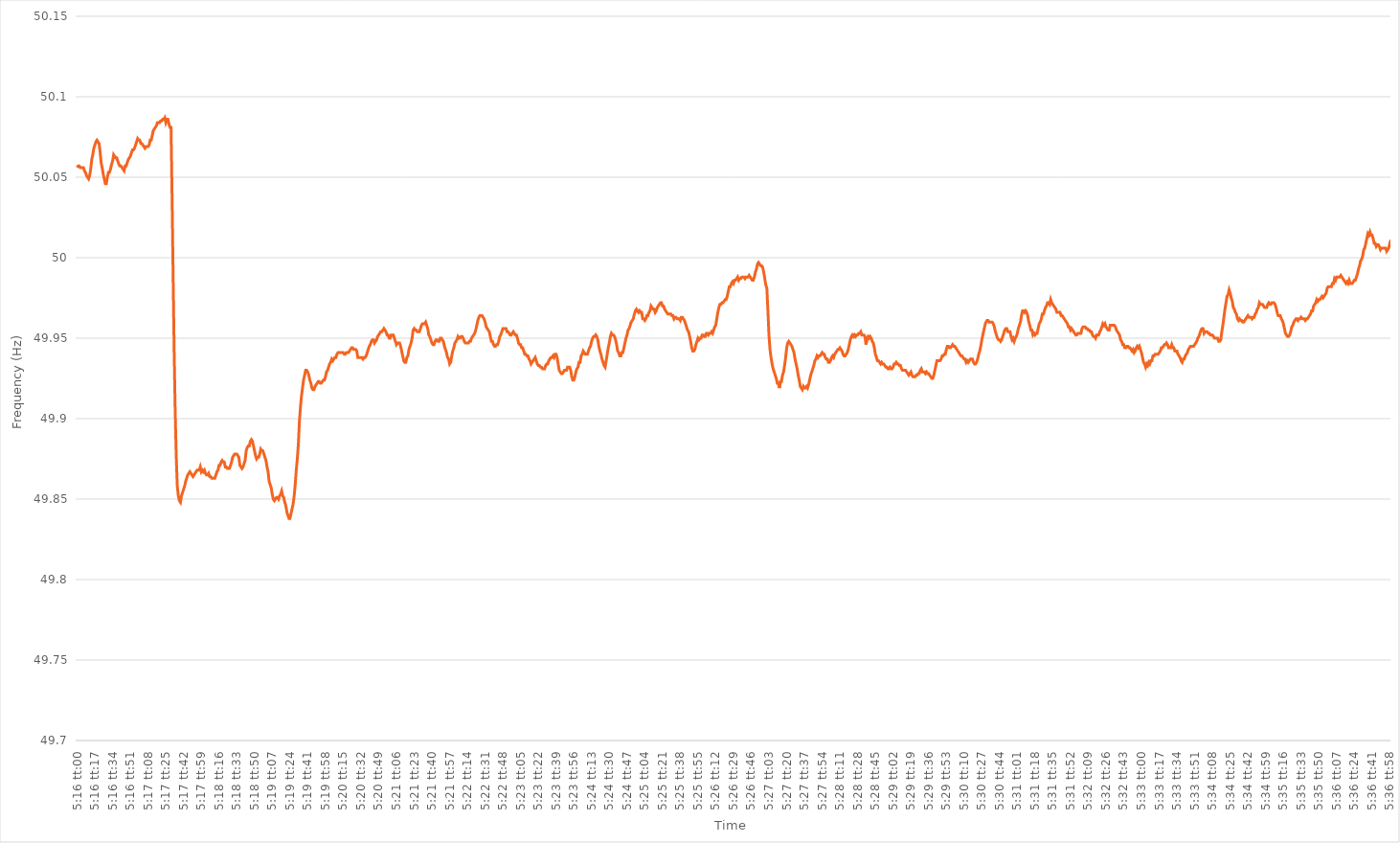
| Category | Series 0 |
|---|---|
| 0.21944444444444444 | 50.056 |
| 0.2194560185185185 | 50.057 |
| 0.2194675925925926 | 50.057 |
| 0.21947916666666667 | 50.056 |
| 0.21949074074074074 | 50.056 |
| 0.21950231481481483 | 50.056 |
| 0.2195138888888889 | 50.056 |
| 0.21952546296296296 | 50.054 |
| 0.21953703703703706 | 50.053 |
| 0.21954861111111112 | 50.051 |
| 0.2195601851851852 | 50.05 |
| 0.21957175925925929 | 50.049 |
| 0.21958333333333332 | 50.051 |
| 0.2195949074074074 | 50.055 |
| 0.21960648148148146 | 50.061 |
| 0.21961805555555555 | 50.064 |
| 0.21962962962962962 | 50.068 |
| 0.21964120370370369 | 50.07 |
| 0.21965277777777778 | 50.072 |
| 0.21966435185185185 | 50.073 |
| 0.2196759259259259 | 50.072 |
| 0.2196875 | 50.071 |
| 0.21969907407407407 | 50.066 |
| 0.21971064814814814 | 50.059 |
| 0.21972222222222224 | 50.056 |
| 0.2197337962962963 | 50.052 |
| 0.21974537037037037 | 50.049 |
| 0.21975694444444446 | 50.046 |
| 0.21976851851851853 | 50.046 |
| 0.2197800925925926 | 50.05 |
| 0.2197916666666667 | 50.053 |
| 0.21980324074074076 | 50.053 |
| 0.21981481481481482 | 50.055 |
| 0.21982638888888886 | 50.058 |
| 0.21983796296296296 | 50.06 |
| 0.21984953703703702 | 50.064 |
| 0.2198611111111111 | 50.063 |
| 0.21987268518518518 | 50.062 |
| 0.21988425925925925 | 50.062 |
| 0.21989583333333332 | 50.06 |
| 0.2199074074074074 | 50.058 |
| 0.21991898148148148 | 50.057 |
| 0.21993055555555555 | 50.057 |
| 0.21994212962962964 | 50.056 |
| 0.2199537037037037 | 50.055 |
| 0.21996527777777777 | 50.054 |
| 0.21997685185185187 | 50.057 |
| 0.21998842592592593 | 50.057 |
| 0.22 | 50.059 |
| 0.2200115740740741 | 50.061 |
| 0.22002314814814816 | 50.062 |
| 0.22003472222222223 | 50.063 |
| 0.22004629629629632 | 50.065 |
| 0.22005787037037036 | 50.067 |
| 0.22006944444444443 | 50.067 |
| 0.2200810185185185 | 50.068 |
| 0.2200925925925926 | 50.07 |
| 0.22010416666666666 | 50.072 |
| 0.22011574074074072 | 50.074 |
| 0.22012731481481482 | 50.073 |
| 0.22013888888888888 | 50.073 |
| 0.22015046296296295 | 50.071 |
| 0.22016203703703704 | 50.071 |
| 0.2201736111111111 | 50.07 |
| 0.22018518518518518 | 50.069 |
| 0.22019675925925927 | 50.068 |
| 0.22020833333333334 | 50.069 |
| 0.2202199074074074 | 50.069 |
| 0.2202314814814815 | 50.069 |
| 0.22024305555555557 | 50.07 |
| 0.22025462962962963 | 50.073 |
| 0.22026620370370373 | 50.073 |
| 0.2202777777777778 | 50.076 |
| 0.22028935185185183 | 50.079 |
| 0.2203009259259259 | 50.08 |
| 0.2203125 | 50.081 |
| 0.22032407407407406 | 50.082 |
| 0.22033564814814813 | 50.084 |
| 0.22034722222222222 | 50.084 |
| 0.2203587962962963 | 50.084 |
| 0.22037037037037036 | 50.085 |
| 0.22038194444444445 | 50.085 |
| 0.22039351851851852 | 50.086 |
| 0.22040509259259258 | 50.086 |
| 0.22041666666666668 | 50.087 |
| 0.22042824074074074 | 50.084 |
| 0.2204398148148148 | 50.086 |
| 0.2204513888888889 | 50.086 |
| 0.22046296296296297 | 50.083 |
| 0.22047453703703704 | 50.081 |
| 0.22048611111111113 | 50.081 |
| 0.2204976851851852 | 50.037 |
| 0.22050925925925927 | 49.988 |
| 0.22052083333333336 | 49.941 |
| 0.2205324074074074 | 49.904 |
| 0.22054398148148147 | 49.876 |
| 0.22055555555555553 | 49.858 |
| 0.22056712962962963 | 49.852 |
| 0.2205787037037037 | 49.849 |
| 0.22059027777777776 | 49.848 |
| 0.22060185185185185 | 49.852 |
| 0.22061342592592592 | 49.854 |
| 0.220625 | 49.856 |
| 0.22063657407407408 | 49.858 |
| 0.22064814814814815 | 49.861 |
| 0.22065972222222222 | 49.863 |
| 0.2206712962962963 | 49.865 |
| 0.22068287037037038 | 49.866 |
| 0.22069444444444444 | 49.867 |
| 0.22070601851851854 | 49.866 |
| 0.2207175925925926 | 49.865 |
| 0.22072916666666667 | 49.864 |
| 0.22074074074074077 | 49.865 |
| 0.22075231481481483 | 49.866 |
| 0.22076388888888887 | 49.867 |
| 0.22077546296296294 | 49.868 |
| 0.22078703703703703 | 49.868 |
| 0.2207986111111111 | 49.868 |
| 0.22081018518518516 | 49.87 |
| 0.22082175925925926 | 49.867 |
| 0.22083333333333333 | 49.868 |
| 0.2208449074074074 | 49.867 |
| 0.2208564814814815 | 49.868 |
| 0.22086805555555555 | 49.866 |
| 0.22087962962962962 | 49.865 |
| 0.22089120370370371 | 49.865 |
| 0.22090277777777778 | 49.866 |
| 0.22091435185185185 | 49.864 |
| 0.22092592592592594 | 49.864 |
| 0.2209375 | 49.863 |
| 0.22094907407407408 | 49.863 |
| 0.22096064814814817 | 49.863 |
| 0.22097222222222224 | 49.863 |
| 0.2209837962962963 | 49.865 |
| 0.2209953703703704 | 49.867 |
| 0.22100694444444444 | 49.868 |
| 0.2210185185185185 | 49.871 |
| 0.22103009259259257 | 49.871 |
| 0.22104166666666666 | 49.873 |
| 0.22105324074074073 | 49.874 |
| 0.2210648148148148 | 49.873 |
| 0.2210763888888889 | 49.873 |
| 0.22108796296296296 | 49.87 |
| 0.22109953703703702 | 49.87 |
| 0.22111111111111112 | 49.869 |
| 0.22112268518518519 | 49.869 |
| 0.22113425925925925 | 49.869 |
| 0.22114583333333335 | 49.871 |
| 0.2211574074074074 | 49.873 |
| 0.22116898148148148 | 49.876 |
| 0.22118055555555557 | 49.877 |
| 0.22119212962962964 | 49.878 |
| 0.2212037037037037 | 49.878 |
| 0.2212152777777778 | 49.878 |
| 0.22122685185185187 | 49.877 |
| 0.2212384259259259 | 49.876 |
| 0.22124999999999997 | 49.871 |
| 0.22126157407407407 | 49.87 |
| 0.22127314814814814 | 49.869 |
| 0.2212847222222222 | 49.87 |
| 0.2212962962962963 | 49.872 |
| 0.22130787037037036 | 49.874 |
| 0.22131944444444443 | 49.88 |
| 0.22133101851851852 | 49.882 |
| 0.2213425925925926 | 49.883 |
| 0.22135416666666666 | 49.883 |
| 0.22136574074074075 | 49.886 |
| 0.22137731481481482 | 49.887 |
| 0.22138888888888889 | 49.886 |
| 0.22140046296296298 | 49.883 |
| 0.22141203703703705 | 49.88 |
| 0.2214236111111111 | 49.877 |
| 0.2214351851851852 | 49.875 |
| 0.22144675925925927 | 49.876 |
| 0.22145833333333334 | 49.876 |
| 0.22146990740740743 | 49.878 |
| 0.22148148148148147 | 49.881 |
| 0.22149305555555554 | 49.88 |
| 0.2215046296296296 | 49.88 |
| 0.2215162037037037 | 49.878 |
| 0.22152777777777777 | 49.876 |
| 0.22153935185185183 | 49.874 |
| 0.22155092592592593 | 49.87 |
| 0.2215625 | 49.867 |
| 0.22157407407407406 | 49.861 |
| 0.22158564814814816 | 49.859 |
| 0.22159722222222222 | 49.857 |
| 0.2216087962962963 | 49.853 |
| 0.22162037037037038 | 49.85 |
| 0.22163194444444445 | 49.849 |
| 0.22164351851851852 | 49.85 |
| 0.2216550925925926 | 49.851 |
| 0.22166666666666668 | 49.851 |
| 0.22167824074074075 | 49.85 |
| 0.22168981481481484 | 49.852 |
| 0.2217013888888889 | 49.853 |
| 0.22171296296296295 | 49.855 |
| 0.221724537037037 | 49.852 |
| 0.2217361111111111 | 49.851 |
| 0.22174768518518517 | 49.848 |
| 0.22175925925925924 | 49.846 |
| 0.22177083333333333 | 49.842 |
| 0.2217824074074074 | 49.84 |
| 0.22179398148148147 | 49.838 |
| 0.22180555555555556 | 49.838 |
| 0.22181712962962963 | 49.841 |
| 0.2218287037037037 | 49.844 |
| 0.2218402777777778 | 49.847 |
| 0.22185185185185186 | 49.852 |
| 0.22186342592592592 | 49.859 |
| 0.22187500000000002 | 49.868 |
| 0.22188657407407408 | 49.875 |
| 0.22189814814814815 | 49.884 |
| 0.22190972222222224 | 49.898 |
| 0.2219212962962963 | 49.907 |
| 0.22193287037037038 | 49.914 |
| 0.22194444444444447 | 49.919 |
| 0.2219560185185185 | 49.924 |
| 0.22196759259259258 | 49.927 |
| 0.22197916666666664 | 49.93 |
| 0.22199074074074074 | 49.93 |
| 0.2220023148148148 | 49.929 |
| 0.22201388888888887 | 49.927 |
| 0.22202546296296297 | 49.924 |
| 0.22203703703703703 | 49.922 |
| 0.2220486111111111 | 49.919 |
| 0.2220601851851852 | 49.918 |
| 0.22207175925925926 | 49.918 |
| 0.22208333333333333 | 49.92 |
| 0.22209490740740742 | 49.921 |
| 0.2221064814814815 | 49.922 |
| 0.22211805555555555 | 49.923 |
| 0.22212962962962965 | 49.923 |
| 0.22214120370370372 | 49.922 |
| 0.22215277777777778 | 49.922 |
| 0.22216435185185188 | 49.923 |
| 0.22217592592592594 | 49.924 |
| 0.22218749999999998 | 49.924 |
| 0.22219907407407405 | 49.926 |
| 0.22221064814814814 | 49.929 |
| 0.2222222222222222 | 49.93 |
| 0.22223379629629628 | 49.932 |
| 0.22224537037037037 | 49.934 |
| 0.22225694444444444 | 49.935 |
| 0.2222685185185185 | 49.937 |
| 0.2222800925925926 | 49.936 |
| 0.22229166666666667 | 49.937 |
| 0.22230324074074073 | 49.938 |
| 0.22231481481481483 | 49.938 |
| 0.2223263888888889 | 49.94 |
| 0.22233796296296296 | 49.941 |
| 0.22234953703703705 | 49.941 |
| 0.22236111111111112 | 49.941 |
| 0.2223726851851852 | 49.941 |
| 0.22238425925925928 | 49.941 |
| 0.22239583333333335 | 49.941 |
| 0.22240740740740741 | 49.94 |
| 0.2224189814814815 | 49.94 |
| 0.22243055555555555 | 49.941 |
| 0.22244212962962961 | 49.941 |
| 0.22245370370370368 | 49.941 |
| 0.22246527777777778 | 49.942 |
| 0.22247685185185184 | 49.943 |
| 0.2224884259259259 | 49.944 |
| 0.2225 | 49.944 |
| 0.22251157407407407 | 49.943 |
| 0.22252314814814814 | 49.943 |
| 0.22253472222222223 | 49.943 |
| 0.2225462962962963 | 49.942 |
| 0.22255787037037036 | 49.938 |
| 0.22256944444444446 | 49.938 |
| 0.22258101851851853 | 49.938 |
| 0.2225925925925926 | 49.938 |
| 0.2226041666666667 | 49.938 |
| 0.22261574074074075 | 49.937 |
| 0.22262731481481482 | 49.938 |
| 0.22263888888888891 | 49.938 |
| 0.22265046296296298 | 49.939 |
| 0.22266203703703702 | 49.941 |
| 0.22267361111111109 | 49.943 |
| 0.22268518518518518 | 49.945 |
| 0.22269675925925925 | 49.946 |
| 0.2227083333333333 | 49.948 |
| 0.2227199074074074 | 49.949 |
| 0.22273148148148147 | 49.949 |
| 0.22274305555555554 | 49.947 |
| 0.22275462962962964 | 49.948 |
| 0.2227662037037037 | 49.949 |
| 0.22277777777777777 | 49.951 |
| 0.22278935185185186 | 49.952 |
| 0.22280092592592593 | 49.953 |
| 0.2228125 | 49.954 |
| 0.2228240740740741 | 49.954 |
| 0.22283564814814816 | 49.955 |
| 0.22284722222222222 | 49.956 |
| 0.22285879629629632 | 49.955 |
| 0.22287037037037039 | 49.954 |
| 0.22288194444444445 | 49.952 |
| 0.2228935185185185 | 49.952 |
| 0.22290509259259259 | 49.95 |
| 0.22291666666666665 | 49.95 |
| 0.22292824074074072 | 49.952 |
| 0.2229398148148148 | 49.952 |
| 0.22295138888888888 | 49.952 |
| 0.22296296296296295 | 49.95 |
| 0.22297453703703704 | 49.948 |
| 0.2229861111111111 | 49.946 |
| 0.22299768518518517 | 49.947 |
| 0.22300925925925927 | 49.947 |
| 0.22302083333333333 | 49.947 |
| 0.2230324074074074 | 49.945 |
| 0.2230439814814815 | 49.942 |
| 0.22305555555555556 | 49.939 |
| 0.22306712962962963 | 49.936 |
| 0.22307870370370372 | 49.935 |
| 0.2230902777777778 | 49.935 |
| 0.22310185185185186 | 49.938 |
| 0.22311342592592595 | 49.939 |
| 0.22312500000000002 | 49.943 |
| 0.22313657407407406 | 49.945 |
| 0.22314814814814812 | 49.947 |
| 0.22315972222222222 | 49.95 |
| 0.22317129629629628 | 49.955 |
| 0.22318287037037035 | 49.956 |
| 0.22319444444444445 | 49.955 |
| 0.2232060185185185 | 49.955 |
| 0.22321759259259258 | 49.954 |
| 0.22322916666666667 | 49.954 |
| 0.22324074074074074 | 49.954 |
| 0.2232523148148148 | 49.956 |
| 0.2232638888888889 | 49.958 |
| 0.22327546296296297 | 49.959 |
| 0.22328703703703703 | 49.959 |
| 0.22329861111111113 | 49.959 |
| 0.2233101851851852 | 49.96 |
| 0.22332175925925926 | 49.958 |
| 0.22333333333333336 | 49.956 |
| 0.22334490740740742 | 49.952 |
| 0.2233564814814815 | 49.951 |
| 0.22336805555555553 | 49.949 |
| 0.22337962962962962 | 49.947 |
| 0.2233912037037037 | 49.946 |
| 0.22340277777777776 | 49.946 |
| 0.22341435185185185 | 49.948 |
| 0.22342592592592592 | 49.949 |
| 0.22343749999999998 | 49.949 |
| 0.22344907407407408 | 49.948 |
| 0.22346064814814814 | 49.948 |
| 0.2234722222222222 | 49.95 |
| 0.2234837962962963 | 49.95 |
| 0.22349537037037037 | 49.949 |
| 0.22350694444444444 | 49.948 |
| 0.22351851851851853 | 49.945 |
| 0.2235300925925926 | 49.943 |
| 0.22354166666666667 | 49.941 |
| 0.22355324074074076 | 49.938 |
| 0.22356481481481483 | 49.937 |
| 0.2235763888888889 | 49.934 |
| 0.223587962962963 | 49.935 |
| 0.22359953703703705 | 49.939 |
| 0.2236111111111111 | 49.942 |
| 0.22362268518518516 | 49.944 |
| 0.22363425925925925 | 49.947 |
| 0.22364583333333332 | 49.948 |
| 0.2236574074074074 | 49.949 |
| 0.22366898148148148 | 49.951 |
| 0.22368055555555555 | 49.95 |
| 0.22369212962962962 | 49.95 |
| 0.2237037037037037 | 49.951 |
| 0.22371527777777778 | 49.951 |
| 0.22372685185185184 | 49.95 |
| 0.22373842592592594 | 49.948 |
| 0.22375 | 49.947 |
| 0.22376157407407407 | 49.947 |
| 0.22377314814814817 | 49.947 |
| 0.22378472222222223 | 49.947 |
| 0.2237962962962963 | 49.948 |
| 0.2238078703703704 | 49.948 |
| 0.22381944444444446 | 49.95 |
| 0.22383101851851853 | 49.951 |
| 0.22384259259259257 | 49.952 |
| 0.22385416666666666 | 49.953 |
| 0.22386574074074073 | 49.955 |
| 0.2238773148148148 | 49.958 |
| 0.2238888888888889 | 49.961 |
| 0.22390046296296295 | 49.963 |
| 0.22391203703703702 | 49.964 |
| 0.22392361111111111 | 49.964 |
| 0.22393518518518518 | 49.964 |
| 0.22394675925925925 | 49.963 |
| 0.22395833333333334 | 49.962 |
| 0.2239699074074074 | 49.96 |
| 0.22398148148148148 | 49.957 |
| 0.22399305555555557 | 49.956 |
| 0.22400462962962964 | 49.955 |
| 0.2240162037037037 | 49.954 |
| 0.2240277777777778 | 49.951 |
| 0.22403935185185186 | 49.948 |
| 0.22405092592592593 | 49.948 |
| 0.22406250000000003 | 49.946 |
| 0.2240740740740741 | 49.945 |
| 0.22408564814814813 | 49.945 |
| 0.2240972222222222 | 49.946 |
| 0.2241087962962963 | 49.946 |
| 0.22412037037037036 | 49.948 |
| 0.22413194444444443 | 49.951 |
| 0.22414351851851852 | 49.952 |
| 0.2241550925925926 | 49.954 |
| 0.22416666666666665 | 49.956 |
| 0.22417824074074075 | 49.956 |
| 0.22418981481481481 | 49.956 |
| 0.22420138888888888 | 49.956 |
| 0.22421296296296298 | 49.954 |
| 0.22422453703703704 | 49.954 |
| 0.2242361111111111 | 49.953 |
| 0.2242476851851852 | 49.952 |
| 0.22425925925925927 | 49.952 |
| 0.22427083333333334 | 49.953 |
| 0.22428240740740743 | 49.954 |
| 0.2242939814814815 | 49.953 |
| 0.22430555555555556 | 49.952 |
| 0.2243171296296296 | 49.952 |
| 0.2243287037037037 | 49.95 |
| 0.22434027777777776 | 49.947 |
| 0.22435185185185183 | 49.946 |
| 0.22436342592592592 | 49.946 |
| 0.224375 | 49.944 |
| 0.22438657407407406 | 49.944 |
| 0.22439814814814815 | 49.942 |
| 0.22440972222222222 | 49.94 |
| 0.22442129629629629 | 49.94 |
| 0.22443287037037038 | 49.939 |
| 0.22444444444444445 | 49.939 |
| 0.2244560185185185 | 49.937 |
| 0.2244675925925926 | 49.936 |
| 0.22447916666666667 | 49.934 |
| 0.22449074074074074 | 49.935 |
| 0.22450231481481484 | 49.936 |
| 0.2245138888888889 | 49.937 |
| 0.22452546296296297 | 49.938 |
| 0.22453703703703706 | 49.936 |
| 0.22454861111111113 | 49.934 |
| 0.22456018518518517 | 49.933 |
| 0.22457175925925923 | 49.933 |
| 0.22458333333333333 | 49.932 |
| 0.2245949074074074 | 49.932 |
| 0.22460648148148146 | 49.931 |
| 0.22461805555555556 | 49.931 |
| 0.22462962962962962 | 49.931 |
| 0.2246412037037037 | 49.933 |
| 0.22465277777777778 | 49.934 |
| 0.22466435185185185 | 49.934 |
| 0.22467592592592592 | 49.936 |
| 0.2246875 | 49.937 |
| 0.22469907407407408 | 49.938 |
| 0.22471064814814815 | 49.938 |
| 0.22472222222222224 | 49.939 |
| 0.2247337962962963 | 49.938 |
| 0.22474537037037037 | 49.94 |
| 0.22475694444444447 | 49.94 |
| 0.22476851851851853 | 49.938 |
| 0.2247800925925926 | 49.934 |
| 0.22479166666666664 | 49.93 |
| 0.22480324074074073 | 49.929 |
| 0.2248148148148148 | 49.928 |
| 0.22482638888888887 | 49.928 |
| 0.22483796296296296 | 49.929 |
| 0.22484953703703703 | 49.93 |
| 0.2248611111111111 | 49.93 |
| 0.2248726851851852 | 49.93 |
| 0.22488425925925926 | 49.932 |
| 0.22489583333333332 | 49.932 |
| 0.22490740740740742 | 49.932 |
| 0.22491898148148148 | 49.93 |
| 0.22493055555555555 | 49.926 |
| 0.22494212962962964 | 49.924 |
| 0.2249537037037037 | 49.924 |
| 0.22496527777777778 | 49.926 |
| 0.22497685185185187 | 49.929 |
| 0.22498842592592594 | 49.931 |
| 0.225 | 49.932 |
| 0.2250115740740741 | 49.935 |
| 0.22502314814814817 | 49.935 |
| 0.2250347222222222 | 49.939 |
| 0.22504629629629627 | 49.94 |
| 0.22505787037037037 | 49.942 |
| 0.22506944444444443 | 49.941 |
| 0.2250810185185185 | 49.94 |
| 0.2250925925925926 | 49.94 |
| 0.22510416666666666 | 49.94 |
| 0.22511574074074073 | 49.942 |
| 0.22512731481481482 | 49.944 |
| 0.2251388888888889 | 49.945 |
| 0.22515046296296296 | 49.948 |
| 0.22516203703703705 | 49.95 |
| 0.22517361111111112 | 49.951 |
| 0.22518518518518518 | 49.951 |
| 0.22519675925925928 | 49.952 |
| 0.22520833333333334 | 49.951 |
| 0.2252199074074074 | 49.949 |
| 0.2252314814814815 | 49.945 |
| 0.22524305555555557 | 49.942 |
| 0.22525462962962964 | 49.94 |
| 0.22526620370370368 | 49.937 |
| 0.22527777777777777 | 49.935 |
| 0.22528935185185184 | 49.933 |
| 0.2253009259259259 | 49.932 |
| 0.2253125 | 49.936 |
| 0.22532407407407407 | 49.94 |
| 0.22533564814814813 | 49.944 |
| 0.22534722222222223 | 49.947 |
| 0.2253587962962963 | 49.951 |
| 0.22537037037037036 | 49.953 |
| 0.22538194444444445 | 49.952 |
| 0.22539351851851852 | 49.952 |
| 0.2254050925925926 | 49.951 |
| 0.22541666666666668 | 49.949 |
| 0.22542824074074075 | 49.946 |
| 0.22543981481481482 | 49.942 |
| 0.2254513888888889 | 49.941 |
| 0.22546296296296298 | 49.939 |
| 0.22547453703703704 | 49.939 |
| 0.22548611111111114 | 49.941 |
| 0.22549768518518518 | 49.941 |
| 0.22550925925925924 | 49.944 |
| 0.2255208333333333 | 49.947 |
| 0.2255324074074074 | 49.95 |
| 0.22554398148148147 | 49.952 |
| 0.22555555555555554 | 49.955 |
| 0.22556712962962963 | 49.956 |
| 0.2255787037037037 | 49.958 |
| 0.22559027777777776 | 49.96 |
| 0.22560185185185186 | 49.961 |
| 0.22561342592592593 | 49.962 |
| 0.225625 | 49.965 |
| 0.2256365740740741 | 49.967 |
| 0.22564814814814815 | 49.968 |
| 0.22565972222222222 | 49.967 |
| 0.22567129629629631 | 49.966 |
| 0.22568287037037038 | 49.967 |
| 0.22569444444444445 | 49.966 |
| 0.22570601851851854 | 49.966 |
| 0.2257175925925926 | 49.962 |
| 0.22572916666666668 | 49.962 |
| 0.22574074074074071 | 49.961 |
| 0.2257523148148148 | 49.962 |
| 0.22576388888888888 | 49.964 |
| 0.22577546296296294 | 49.964 |
| 0.22578703703703704 | 49.966 |
| 0.2257986111111111 | 49.967 |
| 0.22581018518518517 | 49.97 |
| 0.22582175925925926 | 49.969 |
| 0.22583333333333333 | 49.968 |
| 0.2258449074074074 | 49.968 |
| 0.2258564814814815 | 49.966 |
| 0.22586805555555556 | 49.967 |
| 0.22587962962962962 | 49.969 |
| 0.22589120370370372 | 49.97 |
| 0.22590277777777779 | 49.971 |
| 0.22591435185185185 | 49.972 |
| 0.22592592592592595 | 49.972 |
| 0.2259375 | 49.97 |
| 0.22594907407407408 | 49.97 |
| 0.22596064814814817 | 49.968 |
| 0.2259722222222222 | 49.967 |
| 0.22598379629629628 | 49.966 |
| 0.22599537037037035 | 49.965 |
| 0.22600694444444444 | 49.965 |
| 0.2260185185185185 | 49.965 |
| 0.22603009259259257 | 49.965 |
| 0.22604166666666667 | 49.964 |
| 0.22605324074074074 | 49.964 |
| 0.2260648148148148 | 49.962 |
| 0.2260763888888889 | 49.963 |
| 0.22608796296296296 | 49.963 |
| 0.22609953703703703 | 49.962 |
| 0.22611111111111112 | 49.962 |
| 0.2261226851851852 | 49.962 |
| 0.22613425925925926 | 49.961 |
| 0.22614583333333335 | 49.963 |
| 0.22615740740740742 | 49.963 |
| 0.22616898148148148 | 49.962 |
| 0.22618055555555558 | 49.961 |
| 0.22619212962962965 | 49.959 |
| 0.2262037037037037 | 49.957 |
| 0.22621527777777775 | 49.955 |
| 0.22622685185185185 | 49.954 |
| 0.2262384259259259 | 49.951 |
| 0.22624999999999998 | 49.948 |
| 0.22626157407407407 | 49.944 |
| 0.22627314814814814 | 49.942 |
| 0.2262847222222222 | 49.942 |
| 0.2262962962962963 | 49.943 |
| 0.22630787037037037 | 49.946 |
| 0.22631944444444443 | 49.948 |
| 0.22633101851851853 | 49.95 |
| 0.2263425925925926 | 49.949 |
| 0.22635416666666666 | 49.95 |
| 0.22636574074074076 | 49.95 |
| 0.22637731481481482 | 49.952 |
| 0.2263888888888889 | 49.952 |
| 0.22640046296296298 | 49.951 |
| 0.22641203703703705 | 49.951 |
| 0.22642361111111112 | 49.953 |
| 0.2264351851851852 | 49.953 |
| 0.22644675925925925 | 49.952 |
| 0.22645833333333332 | 49.953 |
| 0.22646990740740738 | 49.953 |
| 0.22648148148148148 | 49.954 |
| 0.22649305555555554 | 49.953 |
| 0.2265046296296296 | 49.955 |
| 0.2265162037037037 | 49.957 |
| 0.22652777777777777 | 49.958 |
| 0.22653935185185184 | 49.962 |
| 0.22655092592592593 | 49.966 |
| 0.2265625 | 49.969 |
| 0.22657407407407407 | 49.971 |
| 0.22658564814814816 | 49.971 |
| 0.22659722222222223 | 49.972 |
| 0.2266087962962963 | 49.972 |
| 0.2266203703703704 | 49.973 |
| 0.22663194444444446 | 49.974 |
| 0.22664351851851852 | 49.974 |
| 0.22665509259259262 | 49.976 |
| 0.22666666666666668 | 49.979 |
| 0.22667824074074075 | 49.982 |
| 0.2266898148148148 | 49.982 |
| 0.22670138888888888 | 49.984 |
| 0.22671296296296295 | 49.985 |
| 0.22672453703703702 | 49.984 |
| 0.2267361111111111 | 49.986 |
| 0.22674768518518518 | 49.986 |
| 0.22675925925925924 | 49.987 |
| 0.22677083333333334 | 49.988 |
| 0.2267824074074074 | 49.986 |
| 0.22679398148148147 | 49.987 |
| 0.22680555555555557 | 49.987 |
| 0.22681712962962963 | 49.988 |
| 0.2268287037037037 | 49.988 |
| 0.2268402777777778 | 49.988 |
| 0.22685185185185186 | 49.987 |
| 0.22686342592592593 | 49.988 |
| 0.22687500000000002 | 49.988 |
| 0.2268865740740741 | 49.988 |
| 0.22689814814814815 | 49.989 |
| 0.22690972222222225 | 49.988 |
| 0.2269212962962963 | 49.987 |
| 0.22693287037037035 | 49.986 |
| 0.22694444444444442 | 49.986 |
| 0.22695601851851852 | 49.988 |
| 0.22696759259259258 | 49.991 |
| 0.22697916666666665 | 49.993 |
| 0.22699074074074074 | 49.996 |
| 0.2270023148148148 | 49.997 |
| 0.22701388888888888 | 49.996 |
| 0.22702546296296297 | 49.995 |
| 0.22703703703703704 | 49.995 |
| 0.2270486111111111 | 49.994 |
| 0.2270601851851852 | 49.991 |
| 0.22707175925925926 | 49.987 |
| 0.22708333333333333 | 49.983 |
| 0.22709490740740743 | 49.981 |
| 0.2271064814814815 | 49.967 |
| 0.22711805555555556 | 49.952 |
| 0.22712962962962965 | 49.943 |
| 0.22714120370370372 | 49.938 |
| 0.2271527777777778 | 49.934 |
| 0.22716435185185183 | 49.931 |
| 0.22717592592592592 | 49.929 |
| 0.2271875 | 49.927 |
| 0.22719907407407405 | 49.925 |
| 0.22721064814814815 | 49.922 |
| 0.22722222222222221 | 49.922 |
| 0.22723379629629628 | 49.919 |
| 0.22724537037037038 | 49.923 |
| 0.22725694444444444 | 49.923 |
| 0.2272685185185185 | 49.927 |
| 0.2272800925925926 | 49.929 |
| 0.22729166666666667 | 49.933 |
| 0.22730324074074074 | 49.938 |
| 0.22731481481481483 | 49.944 |
| 0.2273263888888889 | 49.947 |
| 0.22733796296296296 | 49.948 |
| 0.22734953703703706 | 49.947 |
| 0.22736111111111112 | 49.946 |
| 0.2273726851851852 | 49.945 |
| 0.22738425925925929 | 49.943 |
| 0.22739583333333332 | 49.941 |
| 0.2274074074074074 | 49.937 |
| 0.22741898148148146 | 49.934 |
| 0.22743055555555555 | 49.931 |
| 0.22744212962962962 | 49.927 |
| 0.22745370370370369 | 49.924 |
| 0.22746527777777778 | 49.92 |
| 0.22747685185185185 | 49.919 |
| 0.2274884259259259 | 49.918 |
| 0.2275 | 49.92 |
| 0.22751157407407407 | 49.919 |
| 0.22752314814814814 | 49.919 |
| 0.22753472222222224 | 49.92 |
| 0.2275462962962963 | 49.919 |
| 0.22755787037037037 | 49.921 |
| 0.22756944444444446 | 49.924 |
| 0.22758101851851853 | 49.927 |
| 0.2275925925925926 | 49.929 |
| 0.2276041666666667 | 49.931 |
| 0.22761574074074076 | 49.933 |
| 0.22762731481481482 | 49.936 |
| 0.22763888888888886 | 49.937 |
| 0.22765046296296296 | 49.939 |
| 0.22766203703703702 | 49.938 |
| 0.2276736111111111 | 49.939 |
| 0.22768518518518518 | 49.939 |
| 0.22769675925925925 | 49.94 |
| 0.22770833333333332 | 49.941 |
| 0.2277199074074074 | 49.94 |
| 0.22773148148148148 | 49.94 |
| 0.22774305555555555 | 49.938 |
| 0.22775462962962964 | 49.937 |
| 0.2277662037037037 | 49.937 |
| 0.22777777777777777 | 49.935 |
| 0.22778935185185187 | 49.935 |
| 0.22780092592592593 | 49.936 |
| 0.2278125 | 49.938 |
| 0.2278240740740741 | 49.939 |
| 0.22783564814814816 | 49.938 |
| 0.22784722222222223 | 49.94 |
| 0.22785879629629632 | 49.941 |
| 0.22787037037037036 | 49.942 |
| 0.22788194444444443 | 49.943 |
| 0.2278935185185185 | 49.943 |
| 0.2279050925925926 | 49.944 |
| 0.22791666666666666 | 49.943 |
| 0.22792824074074072 | 49.942 |
| 0.22793981481481482 | 49.94 |
| 0.22795138888888888 | 49.939 |
| 0.22796296296296295 | 49.939 |
| 0.22797453703703704 | 49.94 |
| 0.2279861111111111 | 49.941 |
| 0.22799768518518518 | 49.943 |
| 0.22800925925925927 | 49.946 |
| 0.22802083333333334 | 49.949 |
| 0.2280324074074074 | 49.951 |
| 0.2280439814814815 | 49.952 |
| 0.22805555555555557 | 49.951 |
| 0.22806712962962963 | 49.952 |
| 0.22807870370370373 | 49.951 |
| 0.2280902777777778 | 49.952 |
| 0.22810185185185183 | 49.952 |
| 0.2281134259259259 | 49.953 |
| 0.228125 | 49.953 |
| 0.22813657407407406 | 49.954 |
| 0.22814814814814813 | 49.952 |
| 0.22815972222222222 | 49.952 |
| 0.2281712962962963 | 49.952 |
| 0.22818287037037036 | 49.951 |
| 0.22819444444444445 | 49.946 |
| 0.22820601851851852 | 49.95 |
| 0.22821759259259258 | 49.951 |
| 0.22822916666666668 | 49.95 |
| 0.22824074074074074 | 49.951 |
| 0.2282523148148148 | 49.95 |
| 0.2282638888888889 | 49.948 |
| 0.22827546296296297 | 49.947 |
| 0.22828703703703704 | 49.944 |
| 0.22829861111111113 | 49.94 |
| 0.2283101851851852 | 49.938 |
| 0.22832175925925927 | 49.936 |
| 0.22833333333333336 | 49.936 |
| 0.2283449074074074 | 49.935 |
| 0.22835648148148147 | 49.934 |
| 0.22836805555555553 | 49.935 |
| 0.22837962962962963 | 49.934 |
| 0.2283912037037037 | 49.934 |
| 0.22840277777777776 | 49.933 |
| 0.22841435185185185 | 49.932 |
| 0.22842592592592592 | 49.932 |
| 0.2284375 | 49.931 |
| 0.22844907407407408 | 49.931 |
| 0.22846064814814815 | 49.932 |
| 0.22847222222222222 | 49.931 |
| 0.2284837962962963 | 49.931 |
| 0.22849537037037038 | 49.932 |
| 0.22850694444444444 | 49.934 |
| 0.22851851851851854 | 49.934 |
| 0.2285300925925926 | 49.935 |
| 0.22854166666666667 | 49.934 |
| 0.22855324074074077 | 49.934 |
| 0.22856481481481483 | 49.933 |
| 0.22857638888888887 | 49.933 |
| 0.22858796296296294 | 49.931 |
| 0.22859953703703703 | 49.93 |
| 0.2286111111111111 | 49.93 |
| 0.22862268518518516 | 49.93 |
| 0.22863425925925926 | 49.93 |
| 0.22864583333333333 | 49.929 |
| 0.2286574074074074 | 49.928 |
| 0.2286689814814815 | 49.927 |
| 0.22868055555555555 | 49.928 |
| 0.22869212962962962 | 49.929 |
| 0.22870370370370371 | 49.927 |
| 0.22871527777777778 | 49.926 |
| 0.22872685185185185 | 49.926 |
| 0.22873842592592594 | 49.926 |
| 0.22875 | 49.927 |
| 0.22876157407407408 | 49.927 |
| 0.22877314814814817 | 49.928 |
| 0.22878472222222224 | 49.928 |
| 0.2287962962962963 | 49.93 |
| 0.2288078703703704 | 49.931 |
| 0.22881944444444444 | 49.929 |
| 0.2288310185185185 | 49.929 |
| 0.22884259259259257 | 49.929 |
| 0.22885416666666666 | 49.928 |
| 0.22886574074074073 | 49.929 |
| 0.2288773148148148 | 49.928 |
| 0.2288888888888889 | 49.928 |
| 0.22890046296296296 | 49.927 |
| 0.22891203703703702 | 49.926 |
| 0.22892361111111112 | 49.925 |
| 0.22893518518518519 | 49.925 |
| 0.22894675925925925 | 49.927 |
| 0.22895833333333335 | 49.93 |
| 0.2289699074074074 | 49.933 |
| 0.22898148148148148 | 49.936 |
| 0.22899305555555557 | 49.936 |
| 0.22900462962962964 | 49.936 |
| 0.2290162037037037 | 49.936 |
| 0.2290277777777778 | 49.937 |
| 0.22903935185185187 | 49.939 |
| 0.2290509259259259 | 49.939 |
| 0.22906249999999997 | 49.94 |
| 0.22907407407407407 | 49.94 |
| 0.22908564814814814 | 49.943 |
| 0.2290972222222222 | 49.945 |
| 0.2291087962962963 | 49.945 |
| 0.22912037037037036 | 49.944 |
| 0.22913194444444443 | 49.944 |
| 0.22914351851851852 | 49.945 |
| 0.2291550925925926 | 49.946 |
| 0.22916666666666666 | 49.945 |
| 0.22917824074074075 | 49.945 |
| 0.22918981481481482 | 49.944 |
| 0.22920138888888889 | 49.943 |
| 0.22921296296296298 | 49.942 |
| 0.22922453703703705 | 49.941 |
| 0.2292361111111111 | 49.94 |
| 0.2292476851851852 | 49.939 |
| 0.22925925925925927 | 49.939 |
| 0.2292708333333333 | 49.938 |
| 0.22928240740740743 | 49.937 |
| 0.22929398148148147 | 49.937 |
| 0.22930555555555554 | 49.935 |
| 0.2293171296296296 | 49.936 |
| 0.2293287037037037 | 49.935 |
| 0.22934027777777777 | 49.936 |
| 0.22935185185185183 | 49.937 |
| 0.22936342592592593 | 49.937 |
| 0.229375 | 49.937 |
| 0.22938657407407406 | 49.935 |
| 0.22939814814814816 | 49.934 |
| 0.22940972222222222 | 49.934 |
| 0.2294212962962963 | 49.935 |
| 0.22943287037037038 | 49.937 |
| 0.22944444444444445 | 49.94 |
| 0.22945601851851852 | 49.942 |
| 0.2294675925925926 | 49.945 |
| 0.22947916666666668 | 49.949 |
| 0.22949074074074075 | 49.952 |
| 0.22950231481481484 | 49.955 |
| 0.22951388888888888 | 49.958 |
| 0.22952546296296297 | 49.96 |
| 0.229537037037037 | 49.961 |
| 0.2295486111111111 | 49.961 |
| 0.22956018518518517 | 49.96 |
| 0.22957175925925924 | 49.96 |
| 0.22958333333333333 | 49.96 |
| 0.2295949074074074 | 49.96 |
| 0.22960648148148147 | 49.959 |
| 0.22961805555555556 | 49.957 |
| 0.22962962962962963 | 49.954 |
| 0.2296412037037037 | 49.952 |
| 0.2296527777777778 | 49.95 |
| 0.22966435185185186 | 49.949 |
| 0.22967592592592592 | 49.949 |
| 0.22968750000000002 | 49.948 |
| 0.22969907407407408 | 49.949 |
| 0.22971064814814815 | 49.951 |
| 0.22972222222222224 | 49.953 |
| 0.2297337962962963 | 49.955 |
| 0.22974537037037038 | 49.956 |
| 0.22975694444444442 | 49.956 |
| 0.22976851851851854 | 49.954 |
| 0.22978009259259258 | 49.954 |
| 0.22979166666666664 | 49.954 |
| 0.22980324074074074 | 49.951 |
| 0.2298148148148148 | 49.949 |
| 0.22982638888888887 | 49.95 |
| 0.22983796296296297 | 49.948 |
| 0.22984953703703703 | 49.95 |
| 0.2298611111111111 | 49.951 |
| 0.2298726851851852 | 49.953 |
| 0.22988425925925926 | 49.956 |
| 0.22989583333333333 | 49.958 |
| 0.22990740740740742 | 49.96 |
| 0.2299189814814815 | 49.964 |
| 0.22993055555555555 | 49.967 |
| 0.22994212962962965 | 49.967 |
| 0.22995370370370372 | 49.966 |
| 0.22996527777777778 | 49.967 |
| 0.22997685185185188 | 49.966 |
| 0.22998842592592594 | 49.964 |
| 0.22999999999999998 | 49.96 |
| 0.23001157407407405 | 49.958 |
| 0.23002314814814814 | 49.955 |
| 0.2300347222222222 | 49.955 |
| 0.23004629629629628 | 49.952 |
| 0.23005787037037037 | 49.953 |
| 0.23006944444444444 | 49.952 |
| 0.2300810185185185 | 49.953 |
| 0.2300925925925926 | 49.953 |
| 0.23010416666666667 | 49.956 |
| 0.23011574074074073 | 49.959 |
| 0.23012731481481483 | 49.96 |
| 0.2301388888888889 | 49.962 |
| 0.23015046296296296 | 49.965 |
| 0.23016203703703705 | 49.965 |
| 0.23017361111111112 | 49.967 |
| 0.2301851851851852 | 49.969 |
| 0.23019675925925928 | 49.97 |
| 0.23020833333333335 | 49.972 |
| 0.2302199074074074 | 49.972 |
| 0.2302314814814815 | 49.971 |
| 0.23024305555555555 | 49.974 |
| 0.23025462962962961 | 49.972 |
| 0.23026620370370368 | 49.971 |
| 0.23027777777777778 | 49.97 |
| 0.23028935185185184 | 49.969 |
| 0.2303009259259259 | 49.968 |
| 0.2303125 | 49.966 |
| 0.23032407407407407 | 49.966 |
| 0.23033564814814814 | 49.966 |
| 0.23034722222222223 | 49.966 |
| 0.2303587962962963 | 49.964 |
| 0.23037037037037036 | 49.964 |
| 0.23038194444444446 | 49.963 |
| 0.23039351851851853 | 49.962 |
| 0.2304050925925926 | 49.961 |
| 0.2304166666666667 | 49.96 |
| 0.23042824074074075 | 49.959 |
| 0.23043981481481482 | 49.957 |
| 0.23045138888888891 | 49.957 |
| 0.23046296296296295 | 49.955 |
| 0.23047453703703705 | 49.956 |
| 0.23048611111111109 | 49.955 |
| 0.23049768518518518 | 49.954 |
| 0.23050925925925925 | 49.953 |
| 0.2305208333333333 | 49.952 |
| 0.2305324074074074 | 49.952 |
| 0.23054398148148147 | 49.953 |
| 0.23055555555555554 | 49.953 |
| 0.23056712962962964 | 49.953 |
| 0.2305787037037037 | 49.953 |
| 0.23059027777777777 | 49.956 |
| 0.23060185185185186 | 49.957 |
| 0.23061342592592593 | 49.957 |
| 0.230625 | 49.957 |
| 0.2306365740740741 | 49.956 |
| 0.23064814814814816 | 49.956 |
| 0.23065972222222222 | 49.955 |
| 0.23067129629629632 | 49.955 |
| 0.23068287037037036 | 49.954 |
| 0.23069444444444445 | 49.954 |
| 0.2307060185185185 | 49.952 |
| 0.2307175925925926 | 49.951 |
| 0.23072916666666665 | 49.951 |
| 0.23074074074074072 | 49.95 |
| 0.2307523148148148 | 49.952 |
| 0.23076388888888888 | 49.952 |
| 0.23077546296296295 | 49.952 |
| 0.23078703703703704 | 49.954 |
| 0.2307986111111111 | 49.955 |
| 0.23081018518518517 | 49.957 |
| 0.23082175925925927 | 49.959 |
| 0.23083333333333333 | 49.958 |
| 0.2308449074074074 | 49.959 |
| 0.2308564814814815 | 49.957 |
| 0.23086805555555556 | 49.956 |
| 0.23087962962962963 | 49.955 |
| 0.23089120370370372 | 49.955 |
| 0.2309027777777778 | 49.958 |
| 0.23091435185185186 | 49.958 |
| 0.2309259259259259 | 49.958 |
| 0.23093750000000002 | 49.958 |
| 0.23094907407407406 | 49.958 |
| 0.23096064814814818 | 49.957 |
| 0.23097222222222222 | 49.955 |
| 0.23098379629629628 | 49.954 |
| 0.23099537037037035 | 49.953 |
| 0.23100694444444445 | 49.952 |
| 0.2310185185185185 | 49.949 |
| 0.23103009259259258 | 49.948 |
| 0.23104166666666667 | 49.946 |
| 0.23105324074074074 | 49.946 |
| 0.2310648148148148 | 49.944 |
| 0.2310763888888889 | 49.944 |
| 0.23108796296296297 | 49.945 |
| 0.23109953703703703 | 49.945 |
| 0.23111111111111113 | 49.944 |
| 0.2311226851851852 | 49.944 |
| 0.23113425925925926 | 49.943 |
| 0.23114583333333336 | 49.942 |
| 0.23115740740740742 | 49.943 |
| 0.23116898148148146 | 49.941 |
| 0.23118055555555558 | 49.942 |
| 0.23119212962962962 | 49.944 |
| 0.2312037037037037 | 49.945 |
| 0.23121527777777776 | 49.944 |
| 0.23122685185185185 | 49.945 |
| 0.23123842592592592 | 49.943 |
| 0.23124999999999998 | 49.941 |
| 0.23126157407407408 | 49.938 |
| 0.23127314814814814 | 49.935 |
| 0.2312847222222222 | 49.934 |
| 0.2312962962962963 | 49.932 |
| 0.23130787037037037 | 49.934 |
| 0.23131944444444444 | 49.933 |
| 0.23133101851851853 | 49.935 |
| 0.2313425925925926 | 49.934 |
| 0.23135416666666667 | 49.936 |
| 0.23136574074074076 | 49.936 |
| 0.23137731481481483 | 49.939 |
| 0.2313888888888889 | 49.939 |
| 0.231400462962963 | 49.94 |
| 0.23141203703703703 | 49.94 |
| 0.23142361111111112 | 49.94 |
| 0.23143518518518516 | 49.94 |
| 0.23144675925925925 | 49.941 |
| 0.23145833333333332 | 49.942 |
| 0.2314699074074074 | 49.944 |
| 0.23148148148148148 | 49.944 |
| 0.23149305555555555 | 49.945 |
| 0.23150462962962962 | 49.946 |
| 0.2315162037037037 | 49.946 |
| 0.23152777777777778 | 49.947 |
| 0.23153935185185184 | 49.946 |
| 0.23155092592592594 | 49.944 |
| 0.2315625 | 49.944 |
| 0.23157407407407407 | 49.944 |
| 0.23158564814814817 | 49.946 |
| 0.23159722222222223 | 49.944 |
| 0.2316087962962963 | 49.944 |
| 0.2316203703703704 | 49.942 |
| 0.23163194444444443 | 49.942 |
| 0.23164351851851853 | 49.942 |
| 0.23165509259259257 | 49.94 |
| 0.2316666666666667 | 49.939 |
| 0.23167824074074073 | 49.938 |
| 0.2316898148148148 | 49.936 |
| 0.2317013888888889 | 49.935 |
| 0.23171296296296295 | 49.937 |
| 0.23172453703703702 | 49.937 |
| 0.23173611111111111 | 49.939 |
| 0.23174768518518518 | 49.94 |
| 0.23175925925925925 | 49.941 |
| 0.23177083333333334 | 49.943 |
| 0.2317824074074074 | 49.944 |
| 0.23179398148148148 | 49.945 |
| 0.23180555555555557 | 49.945 |
| 0.23181712962962964 | 49.945 |
| 0.2318287037037037 | 49.945 |
| 0.2318402777777778 | 49.946 |
| 0.23185185185185186 | 49.947 |
| 0.23186342592592593 | 49.948 |
| 0.23187499999999997 | 49.95 |
| 0.2318865740740741 | 49.951 |
| 0.23189814814814813 | 49.953 |
| 0.23190972222222225 | 49.955 |
| 0.2319212962962963 | 49.956 |
| 0.23193287037037036 | 49.956 |
| 0.23194444444444443 | 49.953 |
| 0.23195601851851852 | 49.954 |
| 0.2319675925925926 | 49.954 |
| 0.23197916666666665 | 49.954 |
| 0.23199074074074075 | 49.953 |
| 0.23200231481481481 | 49.953 |
| 0.23201388888888888 | 49.952 |
| 0.23202546296296298 | 49.952 |
| 0.23203703703703704 | 49.952 |
| 0.2320486111111111 | 49.951 |
| 0.2320601851851852 | 49.95 |
| 0.23207175925925927 | 49.95 |
| 0.23208333333333334 | 49.95 |
| 0.23209490740740743 | 49.95 |
| 0.2321064814814815 | 49.948 |
| 0.23211805555555554 | 49.948 |
| 0.23212962962962966 | 49.949 |
| 0.2321412037037037 | 49.954 |
| 0.23215277777777776 | 49.958 |
| 0.23216435185185183 | 49.963 |
| 0.23217592592592592 | 49.968 |
| 0.2321875 | 49.972 |
| 0.23219907407407406 | 49.976 |
| 0.23221064814814815 | 49.977 |
| 0.23222222222222222 | 49.98 |
| 0.23223379629629629 | 49.978 |
| 0.23224537037037038 | 49.975 |
| 0.23225694444444445 | 49.973 |
| 0.2322685185185185 | 49.969 |
| 0.2322800925925926 | 49.968 |
| 0.23229166666666667 | 49.966 |
| 0.23230324074074074 | 49.965 |
| 0.23231481481481484 | 49.962 |
| 0.2323263888888889 | 49.961 |
| 0.23233796296296297 | 49.962 |
| 0.23234953703703706 | 49.961 |
| 0.2323611111111111 | 49.961 |
| 0.2323726851851852 | 49.96 |
| 0.23238425925925923 | 49.96 |
| 0.23239583333333333 | 49.961 |
| 0.2324074074074074 | 49.962 |
| 0.23241898148148146 | 49.963 |
| 0.23243055555555556 | 49.964 |
| 0.23244212962962962 | 49.963 |
| 0.2324537037037037 | 49.963 |
| 0.23246527777777778 | 49.963 |
| 0.23247685185185185 | 49.962 |
| 0.23248842592592592 | 49.963 |
| 0.2325 | 49.963 |
| 0.23251157407407408 | 49.965 |
| 0.23252314814814815 | 49.966 |
| 0.23253472222222224 | 49.968 |
| 0.2325462962962963 | 49.969 |
| 0.23255787037037037 | 49.972 |
| 0.23256944444444447 | 49.971 |
| 0.2325810185185185 | 49.971 |
| 0.2325925925925926 | 49.971 |
| 0.23260416666666664 | 49.97 |
| 0.23261574074074076 | 49.969 |
| 0.2326273148148148 | 49.969 |
| 0.23263888888888887 | 49.969 |
| 0.23265046296296296 | 49.971 |
| 0.23266203703703703 | 49.972 |
| 0.2326736111111111 | 49.971 |
| 0.2326851851851852 | 49.971 |
| 0.23269675925925926 | 49.972 |
| 0.23270833333333332 | 49.972 |
| 0.23271990740740742 | 49.972 |
| 0.23273148148148148 | 49.971 |
| 0.23274305555555555 | 49.969 |
| 0.23275462962962964 | 49.966 |
| 0.2327662037037037 | 49.964 |
| 0.23277777777777778 | 49.964 |
| 0.23278935185185187 | 49.964 |
| 0.23280092592592594 | 49.962 |
| 0.2328125 | 49.961 |
| 0.23282407407407404 | 49.959 |
| 0.23283564814814817 | 49.956 |
| 0.2328472222222222 | 49.953 |
| 0.23285879629629633 | 49.952 |
| 0.23287037037037037 | 49.951 |
| 0.23288194444444443 | 49.951 |
| 0.2328935185185185 | 49.952 |
| 0.2329050925925926 | 49.954 |
| 0.23291666666666666 | 49.957 |
| 0.23292824074074073 | 49.958 |
| 0.23293981481481482 | 49.96 |
| 0.2329513888888889 | 49.961 |
| 0.23296296296296296 | 49.962 |
| 0.23297453703703705 | 49.962 |
| 0.23298611111111112 | 49.961 |
| 0.23299768518518518 | 49.962 |
| 0.23300925925925928 | 49.962 |
| 0.23302083333333334 | 49.963 |
| 0.2330324074074074 | 49.962 |
| 0.2330439814814815 | 49.962 |
| 0.23305555555555557 | 49.962 |
| 0.2330671296296296 | 49.961 |
| 0.23307870370370373 | 49.962 |
| 0.23309027777777777 | 49.962 |
| 0.23310185185185184 | 49.963 |
| 0.2331134259259259 | 49.964 |
| 0.233125 | 49.965 |
| 0.23313657407407407 | 49.967 |
| 0.23314814814814813 | 49.967 |
| 0.23315972222222223 | 49.97 |
| 0.2331712962962963 | 49.971 |
| 0.23318287037037036 | 49.972 |
| 0.23319444444444445 | 49.974 |
| 0.23320601851851852 | 49.973 |
| 0.2332175925925926 | 49.974 |
| 0.23322916666666668 | 49.974 |
| 0.23324074074074075 | 49.975 |
| 0.23325231481481482 | 49.976 |
| 0.2332638888888889 | 49.975 |
| 0.23327546296296298 | 49.976 |
| 0.23328703703703701 | 49.977 |
| 0.23329861111111114 | 49.978 |
| 0.23331018518518518 | 49.981 |
| 0.23332175925925927 | 49.982 |
| 0.2333333333333333 | 49.982 |
| 0.2333449074074074 | 49.982 |
| 0.23335648148148147 | 49.982 |
| 0.23336805555555554 | 49.984 |
| 0.23337962962962963 | 49.984 |
| 0.2333912037037037 | 49.987 |
| 0.23340277777777776 | 49.986 |
| 0.23341435185185186 | 49.988 |
| 0.23342592592592593 | 49.988 |
| 0.2334375 | 49.988 |
| 0.2334490740740741 | 49.988 |
| 0.23346064814814815 | 49.989 |
| 0.23347222222222222 | 49.988 |
| 0.23348379629629631 | 49.987 |
| 0.23349537037037038 | 49.986 |
| 0.23350694444444445 | 49.985 |
| 0.23351851851851854 | 49.984 |
| 0.23353009259259258 | 49.985 |
| 0.23354166666666668 | 49.984 |
| 0.23355324074074071 | 49.986 |
| 0.23356481481481484 | 49.984 |
| 0.23357638888888888 | 49.984 |
| 0.23358796296296294 | 49.984 |
| 0.23359953703703704 | 49.985 |
| 0.2336111111111111 | 49.986 |
| 0.23362268518518517 | 49.986 |
| 0.23363425925925926 | 49.988 |
| 0.23364583333333333 | 49.99 |
| 0.2336574074074074 | 49.993 |
| 0.2336689814814815 | 49.995 |
| 0.23368055555555556 | 49.998 |
| 0.23369212962962962 | 49.999 |
| 0.23370370370370372 | 50.001 |
| 0.23371527777777779 | 50.005 |
| 0.23372685185185185 | 50.006 |
| 0.23373842592592595 | 50.009 |
| 0.23375 | 50.012 |
| 0.23376157407407408 | 50.015 |
| 0.23377314814814812 | 50.014 |
| 0.23378472222222224 | 50.016 |
| 0.23379629629629628 | 50.014 |
| 0.23380787037037035 | 50.014 |
| 0.23381944444444444 | 50.012 |
| 0.2338310185185185 | 50.009 |
| 0.23384259259259257 | 50.009 |
| 0.23385416666666667 | 50.007 |
| 0.23386574074074074 | 50.008 |
| 0.2338773148148148 | 50.008 |
| 0.2338888888888889 | 50.007 |
| 0.23390046296296296 | 50.005 |
| 0.23391203703703703 | 50.006 |
| 0.23392361111111112 | 50.006 |
| 0.2339351851851852 | 50.006 |
| 0.23394675925925926 | 50.006 |
| 0.23395833333333335 | 50.006 |
| 0.23396990740740742 | 50.004 |
| 0.23398148148148148 | 50.005 |
| 0.23399305555555558 | 50.006 |
| 0.23400462962962965 | 50.009 |
| 0.23401620370370368 | 50.011 |